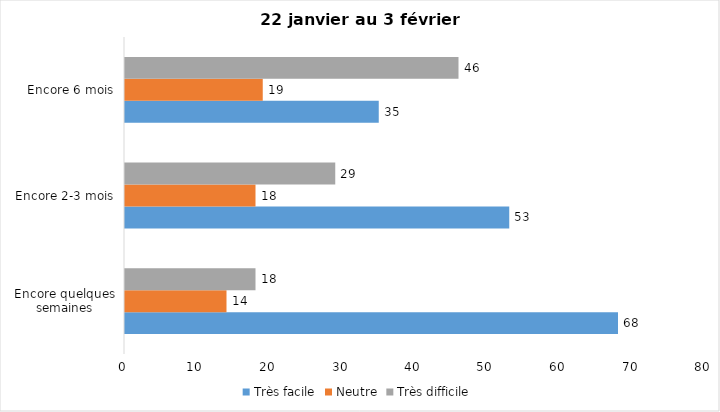
| Category | Très facile | Neutre | Très difficile |
|---|---|---|---|
| Encore quelques semaines | 68 | 14 | 18 |
| Encore 2-3 mois | 53 | 18 | 29 |
| Encore 6 mois | 35 | 19 | 46 |